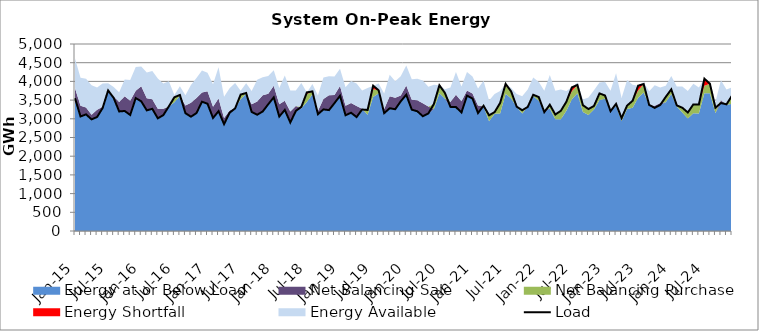
| Category | Load |
|---|---|
| 2015-01-01 | 3550.962 |
| 2015-02-01 | 3062.118 |
| 2015-03-01 | 3118.152 |
| 2015-04-01 | 2985.031 |
| 2015-05-01 | 3048.017 |
| 2015-06-01 | 3286.111 |
| 2015-07-01 | 3758.195 |
| 2015-08-01 | 3559.948 |
| 2015-09-01 | 3196.549 |
| 2015-10-01 | 3209.301 |
| 2015-11-01 | 3102.125 |
| 2015-12-01 | 3553.882 |
| 2016-01-01 | 3466.83 |
| 2016-02-01 | 3225.465 |
| 2016-03-01 | 3267.186 |
| 2016-04-01 | 3012.337 |
| 2016-05-01 | 3098.926 |
| 2016-06-01 | 3333.072 |
| 2016-07-01 | 3576.16 |
| 2016-08-01 | 3637.662 |
| 2016-09-01 | 3150.47 |
| 2016-10-01 | 3056.215 |
| 2016-11-01 | 3152.881 |
| 2016-12-01 | 3457.06 |
| 2017-01-01 | 3402.938 |
| 2017-02-01 | 3022.311 |
| 2017-03-01 | 3202.766 |
| 2017-04-01 | 2857.656 |
| 2017-05-01 | 3161.248 |
| 2017-06-01 | 3278.308 |
| 2017-07-01 | 3647.449 |
| 2017-08-01 | 3690.304 |
| 2017-09-01 | 3184.112 |
| 2017-10-01 | 3108.785 |
| 2017-11-01 | 3195.931 |
| 2017-12-01 | 3389.504 |
| 2018-01-01 | 3573.575 |
| 2018-02-01 | 3061.053 |
| 2018-03-01 | 3237.294 |
| 2018-04-01 | 2901.777 |
| 2018-05-01 | 3210.318 |
| 2018-06-01 | 3319.206 |
| 2018-07-01 | 3706.207 |
| 2018-08-01 | 3732.701 |
| 2018-09-01 | 3122.161 |
| 2018-10-01 | 3251.702 |
| 2018-11-01 | 3232.407 |
| 2018-12-01 | 3419.677 |
| 2019-01-01 | 3614.223 |
| 2019-02-01 | 3095.282 |
| 2019-03-01 | 3162.092 |
| 2019-04-01 | 3046.277 |
| 2019-05-01 | 3248.369 |
| 2019-06-01 | 3236.481 |
| 2019-07-01 | 3885.615 |
| 2019-08-01 | 3761.224 |
| 2019-09-01 | 3151.31 |
| 2019-10-01 | 3281.981 |
| 2019-11-01 | 3256.255 |
| 2019-12-01 | 3467.746 |
| 2020-01-01 | 3643.548 |
| 2020-02-01 | 3244.16 |
| 2020-03-01 | 3201.579 |
| 2020-04-01 | 3069.312 |
| 2020-05-01 | 3143.142 |
| 2020-06-01 | 3395.941 |
| 2020-07-01 | 3896.591 |
| 2020-08-01 | 3691.943 |
| 2020-09-01 | 3318.685 |
| 2020-10-01 | 3313.361 |
| 2020-11-01 | 3169.443 |
| 2020-12-01 | 3619.562 |
| 2021-01-01 | 3540.624 |
| 2021-02-01 | 3153.665 |
| 2021-03-01 | 3349.421 |
| 2021-04-01 | 3093.083 |
| 2021-05-01 | 3178.712 |
| 2021-06-01 | 3422.398 |
| 2021-07-01 | 3933.956 |
| 2021-08-01 | 3730.51 |
| 2021-09-01 | 3324.303 |
| 2021-10-01 | 3228.635 |
| 2021-11-01 | 3316.867 |
| 2021-12-01 | 3642.816 |
| 2022-01-01 | 3581.842 |
| 2022-02-01 | 3179.197 |
| 2022-03-01 | 3376.526 |
| 2022-04-01 | 3113.637 |
| 2022-05-01 | 3214.363 |
| 2022-06-01 | 3455.888 |
| 2022-07-01 | 3840.554 |
| 2022-08-01 | 3905.481 |
| 2022-09-01 | 3363.2 |
| 2022-10-01 | 3260.692 |
| 2022-11-01 | 3343.961 |
| 2022-12-01 | 3679.17 |
| 2023-01-01 | 3623.147 |
| 2023-02-01 | 3203.599 |
| 2023-03-01 | 3398.827 |
| 2023-04-01 | 3020.239 |
| 2023-05-01 | 3353.612 |
| 2023-06-01 | 3482.767 |
| 2023-07-01 | 3885.487 |
| 2023-08-01 | 3929.491 |
| 2023-09-01 | 3370.142 |
| 2023-10-01 | 3292.675 |
| 2023-11-01 | 3370.181 |
| 2023-12-01 | 3585.742 |
| 2024-01-01 | 3786.392 |
| 2024-02-01 | 3358.082 |
| 2024-03-01 | 3295.915 |
| 2024-04-01 | 3168.735 |
| 2024-05-01 | 3385.437 |
| 2024-06-01 | 3380.764 |
| 2024-07-01 | 4072.976 |
| 2024-08-01 | 3937.029 |
| 2024-09-01 | 3296.252 |
| 2024-10-01 | 3422.476 |
| 2024-11-01 | 3386.196 |
| 2024-12-01 | 3618.216 |